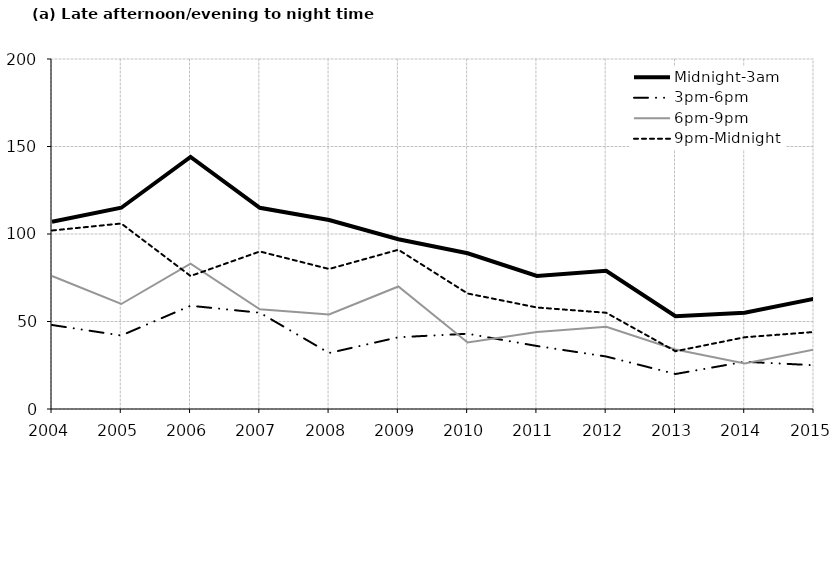
| Category | Midnight-3am | 3pm-6pm | 6pm-9pm | 9pm-Midnight |
|---|---|---|---|---|
| 2004.0 | 107 | 48 | 76 | 102 |
| 2005.0 | 115 | 42 | 60 | 106 |
| 2006.0 | 144 | 59 | 83 | 76 |
| 2007.0 | 115 | 55 | 57 | 90 |
| 2008.0 | 108 | 32 | 54 | 80 |
| 2009.0 | 97 | 41 | 70 | 91 |
| 2010.0 | 89 | 43 | 38 | 66 |
| 2011.0 | 76 | 36 | 44 | 58 |
| 2012.0 | 79 | 30 | 47 | 55 |
| 2013.0 | 53 | 20 | 34 | 33 |
| 2014.0 | 55 | 27 | 26 | 41 |
| 2015.0 | 63 | 25 | 34 | 44 |